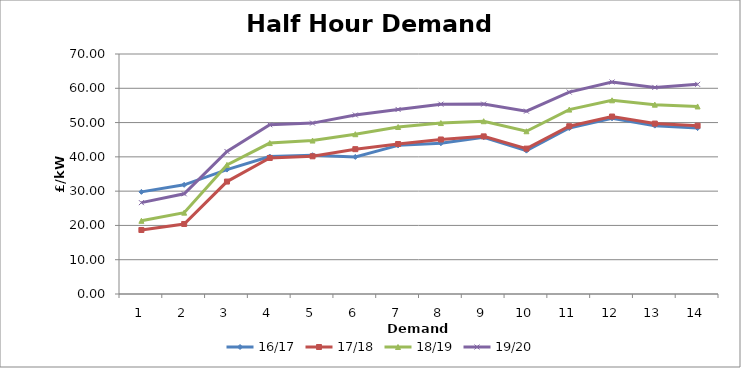
| Category | 16/17 | 17/18 | 18/19 | 19/20 |
|---|---|---|---|---|
| 1.0 | 29.788 | 18.672 | 21.342 | 26.645 |
| 2.0 | 31.844 | 20.422 | 23.729 | 29.228 |
| 3.0 | 36.288 | 32.794 | 37.661 | 41.565 |
| 4.0 | 40.092 | 39.676 | 44.015 | 49.353 |
| 5.0 | 40.479 | 40.16 | 44.755 | 49.843 |
| 6.0 | 39.985 | 42.246 | 46.602 | 52.208 |
| 7.0 | 43.35 | 43.744 | 48.705 | 53.823 |
| 8.0 | 43.964 | 45.071 | 49.859 | 55.37 |
| 9.0 | 45.678 | 45.974 | 50.393 | 55.383 |
| 10.0 | 41.816 | 42.406 | 47.467 | 53.327 |
| 11.0 | 48.411 | 48.933 | 53.777 | 58.889 |
| 12.0 | 51.247 | 51.761 | 56.494 | 61.832 |
| 13.0 | 49.107 | 49.71 | 55.222 | 60.261 |
| 14.0 | 48.38 | 49.09 | 54.697 | 61.147 |